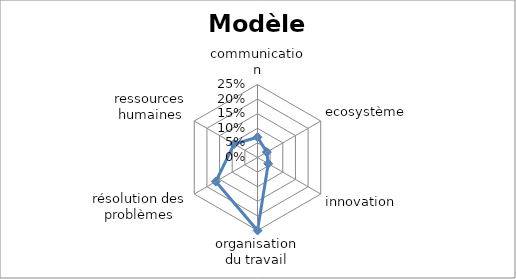
| Category | Series 0 |
|---|---|
| communication | 0.069 |
| ecosystème | 0.037 |
| innovation | 0.042 |
| organisation du travail | 0.25 |
| résolution des problèmes | 0.165 |
| ressources humaines | 0.093 |